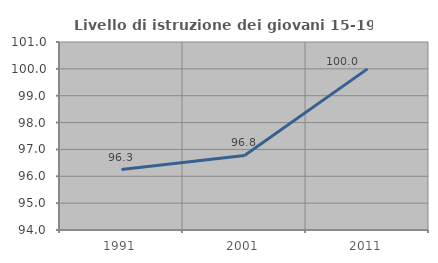
| Category | Livello di istruzione dei giovani 15-19 anni |
|---|---|
| 1991.0 | 96.25 |
| 2001.0 | 96.774 |
| 2011.0 | 100 |